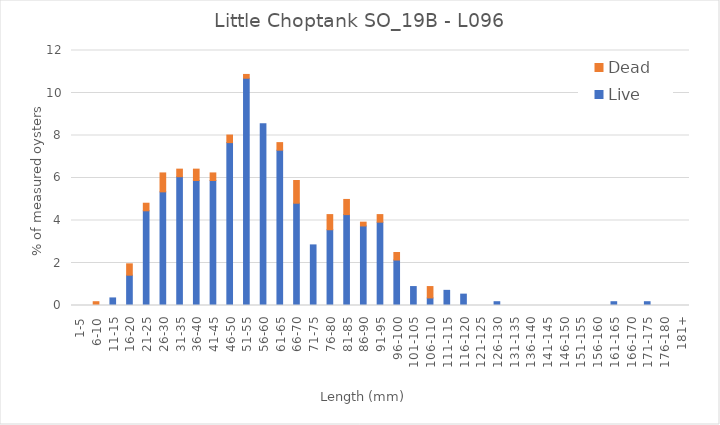
| Category | Live | Dead |
|---|---|---|
| 1-5 | 0 | 0 |
| 6-10 | 0 | 0.178 |
| 11-15 | 0.357 | 0 |
| 16-20 | 1.426 | 0.535 |
| 21-25 | 4.456 | 0.357 |
| 26-30 | 5.348 | 0.891 |
| 31-35 | 6.061 | 0.357 |
| 36-40 | 5.882 | 0.535 |
| 41-45 | 5.882 | 0.357 |
| 46-50 | 7.665 | 0.357 |
| 51-55 | 10.695 | 0.178 |
| 56-60 | 8.556 | 0 |
| 61-65 | 7.308 | 0.357 |
| 66-70 | 4.813 | 1.07 |
| 71-75 | 2.852 | 0 |
| 76-80 | 3.565 | 0.713 |
| 81-85 | 4.278 | 0.713 |
| 86-90 | 3.743 | 0.178 |
| 91-95 | 3.922 | 0.357 |
| 96-100 | 2.139 | 0.357 |
| 101-105 | 0.891 | 0 |
| 106-110 | 0.357 | 0.535 |
| 111-115 | 0.713 | 0 |
| 116-120 | 0.535 | 0 |
| 121-125 | 0 | 0 |
| 126-130 | 0.178 | 0 |
| 131-135 | 0 | 0 |
| 136-140 | 0 | 0 |
| 141-145 | 0 | 0 |
| 146-150 | 0 | 0 |
| 151-155 | 0 | 0 |
| 156-160 | 0 | 0 |
| 161-165 | 0.178 | 0 |
| 166-170 | 0 | 0 |
| 171-175 | 0.178 | 0 |
| 176-180 | 0 | 0 |
| 181+ | 0 | 0 |